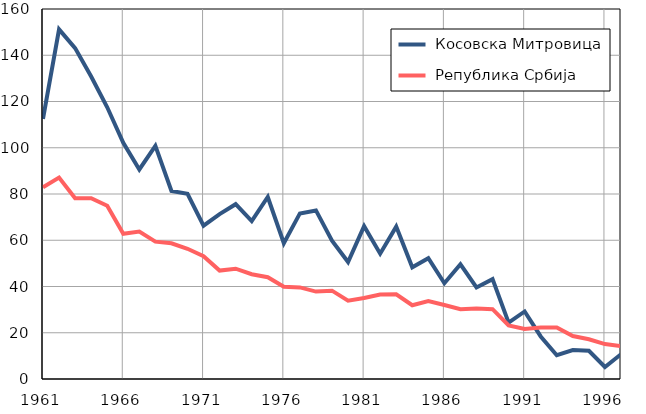
| Category |  Косовска Митровица |  Република Србија |
|---|---|---|
| 1961.0 | 112.5 | 82.9 |
| 1962.0 | 151.2 | 87.1 |
| 1963.0 | 143.1 | 78.2 |
| 1964.0 | 130.8 | 78.2 |
| 1965.0 | 117.5 | 74.9 |
| 1966.0 | 102.1 | 62.8 |
| 1967.0 | 90.6 | 63.8 |
| 1968.0 | 100.8 | 59.4 |
| 1969.0 | 81.3 | 58.7 |
| 1970.0 | 80.1 | 56.3 |
| 1971.0 | 66.3 | 53.1 |
| 1972.0 | 71.3 | 46.9 |
| 1973.0 | 75.6 | 47.7 |
| 1974.0 | 68.3 | 45.3 |
| 1975.0 | 78.7 | 44 |
| 1976.0 | 58.7 | 39.9 |
| 1977.0 | 71.6 | 39.6 |
| 1978.0 | 72.9 | 37.8 |
| 1979.0 | 59.8 | 38.2 |
| 1980.0 | 50.6 | 33.9 |
| 1981.0 | 66.1 | 35 |
| 1982.0 | 54.2 | 36.5 |
| 1983.0 | 65.9 | 36.6 |
| 1984.0 | 48.3 | 31.9 |
| 1985.0 | 52.2 | 33.7 |
| 1986.0 | 41.4 | 32 |
| 1987.0 | 49.6 | 30.2 |
| 1988.0 | 39.6 | 30.5 |
| 1989.0 | 43.2 | 30.2 |
| 1990.0 | 24.4 | 23.2 |
| 1991.0 | 29.2 | 21.6 |
| 1992.0 | 18.4 | 22.3 |
| 1993.0 | 10.3 | 22.3 |
| 1994.0 | 12.5 | 18.6 |
| 1995.0 | 12.2 | 17.2 |
| 1996.0 | 5.2 | 15.1 |
| 1997.0 | 10.7 | 14.2 |